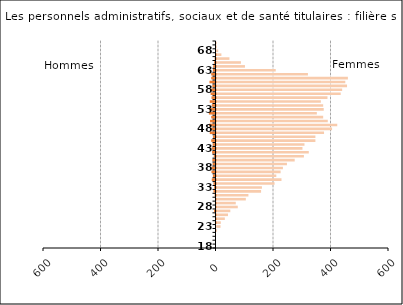
| Category | Series 2 |
|---|---|
| 18.0 | 0 |
| 19.0 | 0 |
| 20.0 | 0 |
| 21.0 | 0 |
| 22.0 | 2 |
| 23.0 | 14 |
| 24.0 | 15 |
| 25.0 | 29 |
| 26.0 | 40 |
| 27.0 | 48 |
| 28.0 | 74 |
| 29.0 | 67 |
| 30.0 | 102 |
| 31.0 | 111 |
| 32.0 | 155 |
| 33.0 | 158 |
| 34.0 | 202 |
| 35.0 | 226 |
| 36.0 | 208 |
| 37.0 | 223 |
| 38.0 | 231 |
| 39.0 | 245 |
| 40.0 | 272 |
| 41.0 | 304 |
| 42.0 | 321 |
| 43.0 | 299 |
| 44.0 | 306 |
| 45.0 | 344 |
| 46.0 | 344 |
| 47.0 | 374 |
| 48.0 | 402 |
| 49.0 | 420 |
| 50.0 | 387 |
| 51.0 | 371 |
| 52.0 | 349 |
| 53.0 | 373 |
| 54.0 | 371 |
| 55.0 | 363 |
| 56.0 | 386 |
| 57.0 | 432 |
| 58.0 | 437 |
| 59.0 | 454 |
| 60.0 | 448 |
| 61.0 | 457 |
| 62.0 | 318 |
| 63.0 | 206 |
| 64.0 | 99 |
| 65.0 | 85 |
| 66.0 | 45 |
| 67.0 | 17 |
| 68.0 | 6 |
| 69.0 | 1 |
| 70.0 | 1 |